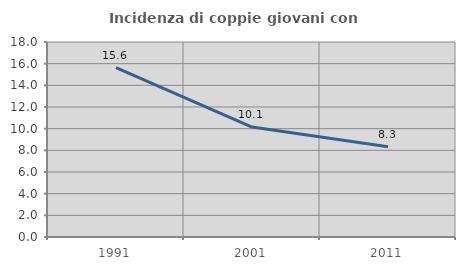
| Category | Incidenza di coppie giovani con figli |
|---|---|
| 1991.0 | 15.642 |
| 2001.0 | 10.149 |
| 2011.0 | 8.333 |